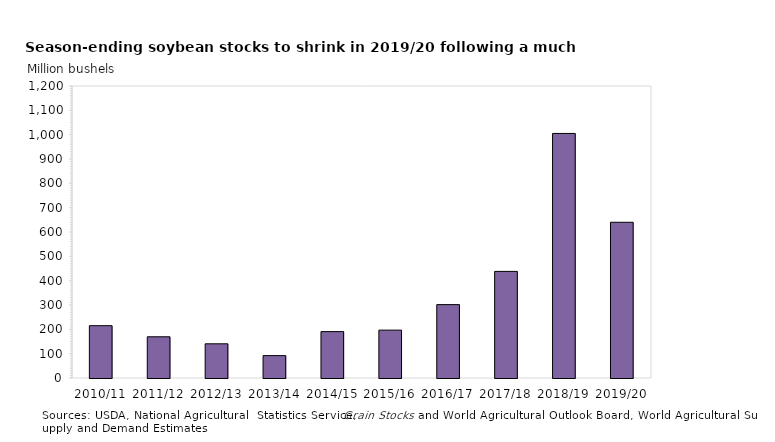
| Category | ending stocks |
|---|---|
| 2010/11 | 215.013 |
| 2011/12 | 169.37 |
| 2012/13 | 140.557 |
| 2013/14 | 91.991 |
| 2014/15 | 190.61 |
| 2015/16 | 196.729 |
| 2016/17 | 301.595 |
| 2017/18 | 438.105 |
| 2018/19 | 1005 |
| 2019/20 | 640 |